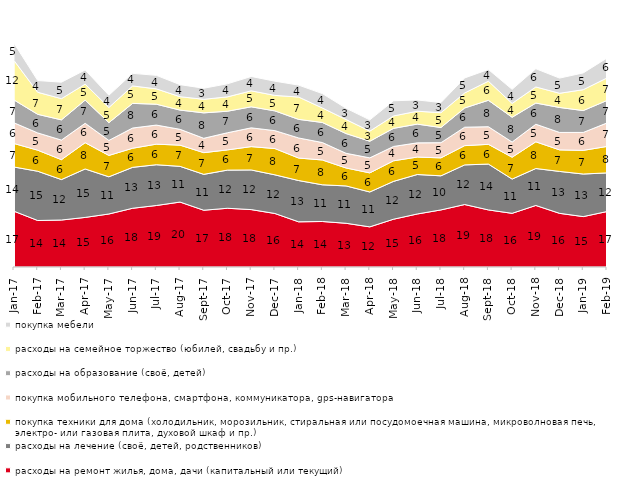
| Category | расходы на ремонт жилья, дома, дачи (капитальный или текущий) | расходы на лечение (своё, детей, родственников) | покупка техники для дома (холодильник, морозильник, стиральная или посудомоечная машина, микроволновая печь, электро- или газовая плита, духовой шкаф и пр.) | покупка мобильного телефона, смартфона, коммуникатора, gps-навигатора | расходы на образование (своё, детей) | расходы на семейное торжество (юбилей, свадьбу и пр.) | покупка мебели |
|---|---|---|---|---|---|---|---|
| 2017-01-01 | 17.1 | 13.55 | 7.2 | 6.35 | 7 | 12.1 | 5.3 |
| 2017-02-01 | 14.25 | 15.1 | 6.45 | 5.3 | 5.7 | 6.75 | 3.6 |
| 2017-03-01 | 14.4 | 12.4 | 6.1 | 6 | 6.2 | 6.5 | 5.05 |
| 2017-04-01 | 15.2 | 14.85 | 8.05 | 5.95 | 7.1 | 4.9 | 4.35 |
| 2017-05-01 | 16.25 | 11.4 | 6.55 | 4.6 | 5.45 | 4.65 | 3.75 |
| 2017-06-01 | 18 | 12.55 | 5.85 | 6.2 | 7.55 | 5.35 | 3.85 |
| 2017-07-01 | 18.85 | 12.5 | 6.3 | 5.85 | 6.4 | 4.7 | 4.15 |
| 2017-08-01 | 19.9 | 10.95 | 6.5 | 4.85 | 5.9 | 4.1 | 3.7 |
| 2017-09-01 | 17.4 | 11 | 6.65 | 4.4 | 7.8 | 4.15 | 3.4 |
| 2017-10-01 | 18 | 11.7 | 6.2 | 5.25 | 6.6 | 4.4 | 4 |
| 2017-11-01 | 17.6 | 12.15 | 7.15 | 5.75 | 6.45 | 4.9 | 4.4 |
| 2017-12-01 | 16.4 | 11.85 | 8.05 | 5.5 | 6.05 | 4.75 | 4.35 |
| 2018-01-01 | 13.85 | 12.65 | 6.9 | 6.15 | 5.7 | 6.85 | 3.65 |
| 2018-02-01 | 13.95 | 11.25 | 7.6 | 5.35 | 6.15 | 4.45 | 4.4 |
| 2018-03-01 | 13.4 | 11.45 | 5.5 | 4.5 | 6.05 | 4.3 | 3.45 |
| 2018-04-01 | 12.3 | 10.7 | 5.85 | 4.6 | 5.1 | 3.1 | 3.45 |
| 2018-05-01 | 14.65 | 11.6 | 6.3 | 4.4 | 5.55 | 3.8 | 4.65 |
| 2018-06-01 | 16.25 | 12.1 | 5.35 | 4.35 | 5.75 | 3.95 | 3.45 |
| 2018-07-01 | 17.5 | 10.45 | 5.5 | 4.65 | 4.65 | 4.55 | 3.1 |
| 2018-08-01 | 19.15 | 12.15 | 5.9 | 5.65 | 5.9 | 4.6 | 4.6 |
| 2018-09-01 | 17.5 | 14.05 | 6.05 | 5.4 | 8.1 | 5.85 | 3.6 |
| 2018-10-01 | 16.45 | 10.5 | 6.7 | 4.65 | 7.6 | 4.25 | 4.3 |
| 2018-11-01 | 18.862 | 11.327 | 8.184 | 5.389 | 6.487 | 4.94 | 5.589 |
| 2018-12-01 | 16.45 | 12.85 | 6.6 | 5.35 | 7.65 | 4.35 | 4.65 |
| 2019-01-01 | 15.45 | 13.05 | 7.25 | 5.5 | 6.7 | 6.4 | 5.15 |
| 2019-02-01 | 17 | 11.85 | 8.1 | 7.2 | 6.9 | 6.9 | 6.1 |